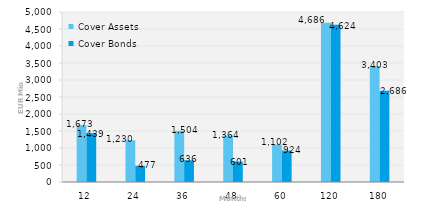
| Category | Cover Assets | Cover Bonds |
|---|---|---|
| 12.0 | 1672.54 | 1438.895 |
| 24.0 | 1230.19 | 476.542 |
| 36.0 | 1504.428 | 636.412 |
| 48.0 | 1364.219 | 600.965 |
| 60.0 | 1102.205 | 924.47 |
| 120.0 | 4685.561 | 4624.202 |
| 180.0 | 3402.796 | 2686.025 |